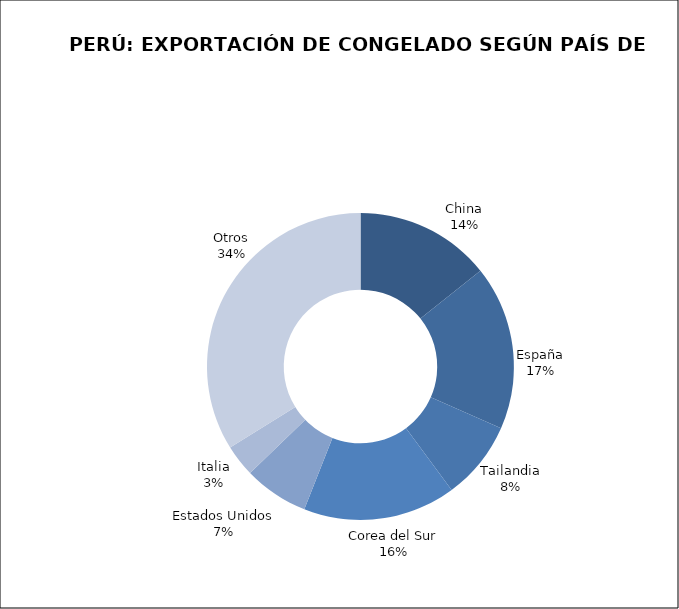
| Category | Series 0 |
|---|---|
| China | 67005.024 |
| España | 81346.95 |
| Tailandia | 38981.518 |
| Corea del Sur | 75504.201 |
| Estados Unidos | 32021.654 |
| Italia | 15819.928 |
| Otros | 158986.916 |